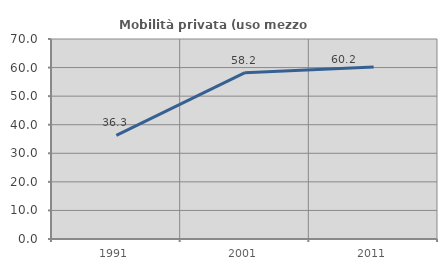
| Category | Mobilità privata (uso mezzo privato) |
|---|---|
| 1991.0 | 36.298 |
| 2001.0 | 58.217 |
| 2011.0 | 60.222 |